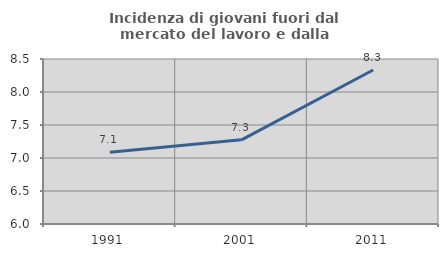
| Category | Incidenza di giovani fuori dal mercato del lavoro e dalla formazione  |
|---|---|
| 1991.0 | 7.086 |
| 2001.0 | 7.275 |
| 2011.0 | 8.333 |